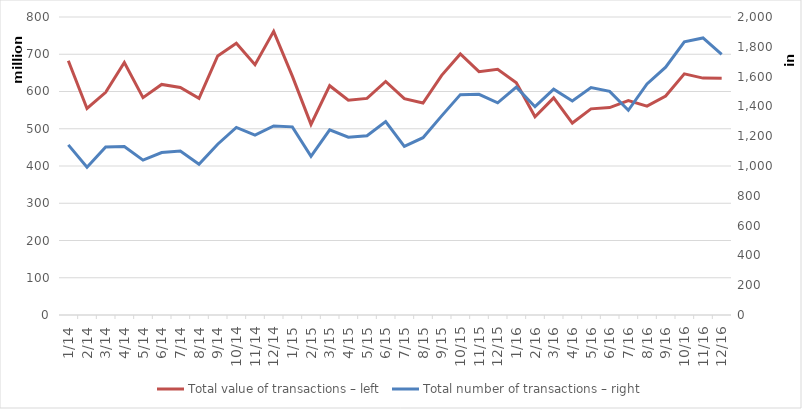
| Category | Total |
|---|---|
| 2014-01-01 | 682486357 |
| 2014-02-01 | 554509462 |
| 2014-03-01 | 597655513 |
| 2014-04-01 | 677759015 |
| 2014-05-01 | 583455556 |
| 2014-06-01 | 619050411 |
| 2014-07-01 | 610679964 |
| 2014-08-01 | 581652263 |
| 2014-09-01 | 695420615 |
| 2014-10-01 | 729293580 |
| 2014-11-01 | 672028830 |
| 2014-12-01 | 761376397 |
| 2015-01-01 | 641299671 |
| 2015-02-01 | 511688951 |
| 2015-03-01 | 615585263 |
| 2015-04-01 | 576421064 |
| 2015-05-01 | 581511130 |
| 2015-06-01 | 627062614 |
| 2015-07-01 | 580709895 |
| 2015-08-01 | 568948581 |
| 2015-09-01 | 643329372 |
| 2015-10-01 | 700607232 |
| 2015-11-01 | 653154508 |
| 2015-12-01 | 659735271 |
| 2016-01-01 | 623719958 |
| 2016-02-01 | 532385709 |
| 2016-03-01 | 582836319 |
| 2016-04-01 | 515291890 |
| 2016-05-01 | 553441839 |
| 2016-06-01 | 556836864 |
| 2016-07-01 | 575613675 |
| 2016-08-01 | 560806298 |
| 2016-09-01 | 588038057 |
| 2016-10-01 | 647245989 |
| 2016-11-01 | 635952032 |
| 2016-12-01 | 635268256 |